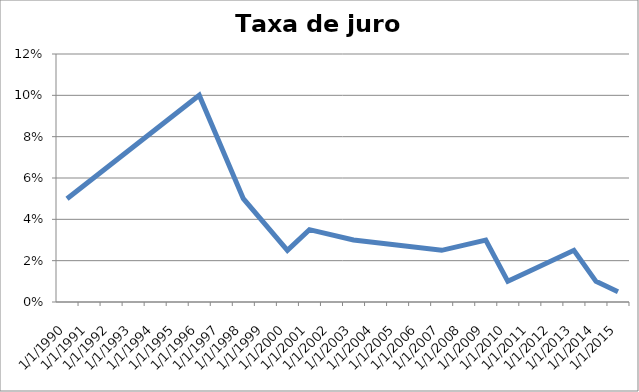
| Category | Taxa de juro legal |
|---|---|
| 12/15/90 | 0.05 |
| 12/31/96 | 0.1 |
| 12/31/98 | 0.05 |
| 12/31/00 | 0.025 |
| 12/31/01 | 0.035 |
| 12/31/03 | 0.03 |
| 12/31/07 | 0.025 |
| 12/31/09 | 0.03 |
| 12/31/10 | 0.01 |
| 12/31/11 | 0.015 |
| 12/31/13 | 0.025 |
| 12/31/14 | 0.01 |
| 12/31/15 | 0.005 |